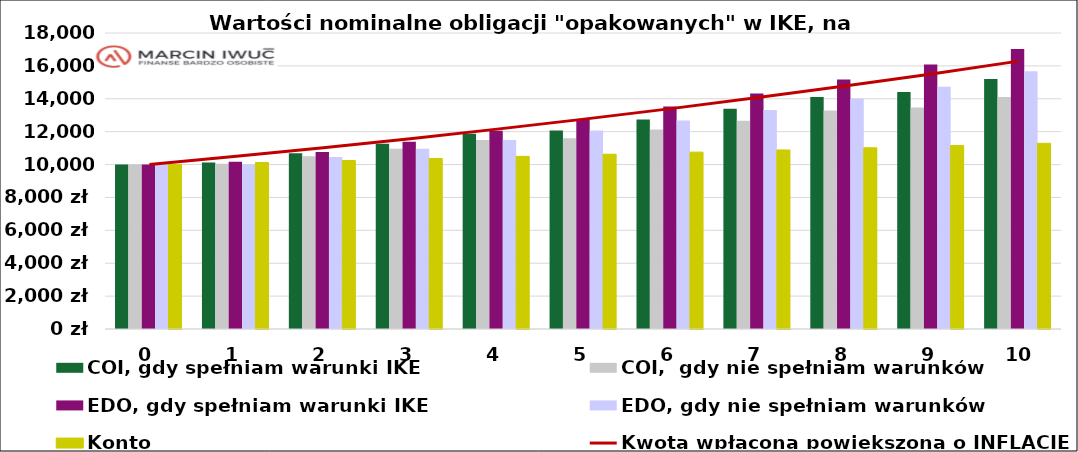
| Category | COI, gdy spełniam warunki IKE | COI,  gdy nie spełniam warunków | EDO, gdy spełniam warunki IKE | EDO, gdy nie spełniam warunków | Konto
oszczędnościowe |
|---|---|---|---|---|---|
| 0.0 | 10000 | 10000 | 10000 | 10000 | 10000 |
| 1.0 | 10130 | 10048.6 | 10170 | 10000 | 10122.179 |
| 2.0 | 10689.17 | 10497.706 | 10762.952 | 10452.714 | 10245.851 |
| 3.0 | 11260.778 | 10954.087 | 11392.623 | 10959.491 | 10371.033 |
| 4.0 | 11865.844 | 11494.886 | 12061.286 | 11497.886 | 10497.745 |
| 5.0 | 12068.669 | 11595.508 | 12771.353 | 12069.869 | 10626.006 |
| 6.0 | 12735.787 | 12131.817 | 13525.385 | 12677.531 | 10755.833 |
| 7.0 | 13399.691 | 12662.79 | 14326.101 | 13323.096 | 10887.247 |
| 8.0 | 14107.523 | 13289.565 | 15176.389 | 14008.925 | 11020.266 |
| 9.0 | 14409.038 | 13466.96 | 16077.695 | 14735.903 | 11154.91 |
| 10.0 | 15201.046 | 14103.87 | 17033.079 | 15668.499 | 11291.2 |